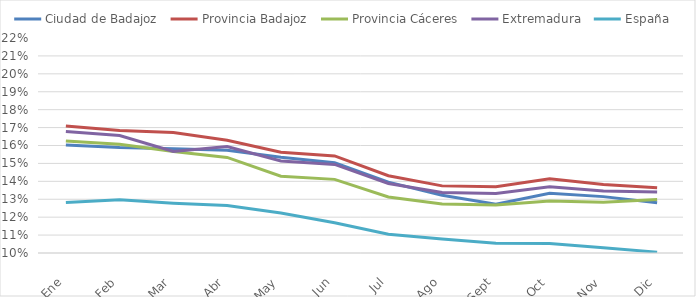
| Category | Ciudad de Badajoz | Provincia Badajoz | Provincia Cáceres | Extremadura | España |
|---|---|---|---|---|---|
| Ene | 0.16 | 0.171 | 0.162 | 0.168 | 0.128 |
| Feb | 0.159 | 0.168 | 0.161 | 0.166 | 0.13 |
| Mar | 0.158 | 0.167 | 0.157 | 0.157 | 0.128 |
| Abr | 0.157 | 0.163 | 0.153 | 0.159 | 0.127 |
| May | 0.153 | 0.156 | 0.143 | 0.151 | 0.122 |
| Jun | 0.15 | 0.154 | 0.141 | 0.149 | 0.117 |
| Jul | 0.14 | 0.143 | 0.131 | 0.139 | 0.111 |
| Ago | 0.132 | 0.137 | 0.127 | 0.134 | 0.108 |
| Sept | 0.127 | 0.137 | 0.127 | 0.133 | 0.105 |
| Oct | 0.133 | 0.141 | 0.129 | 0.137 | 0.105 |
| Nov | 0.131 | 0.138 | 0.128 | 0.135 | 0.103 |
| Dic | 0.128 | 0.136 | 0.13 | 0.134 | 0.1 |